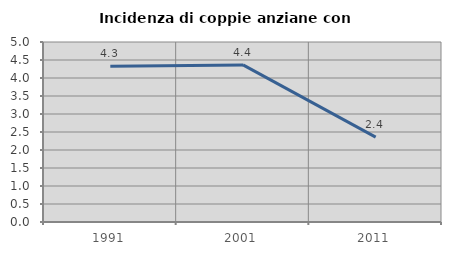
| Category | Incidenza di coppie anziane con figli |
|---|---|
| 1991.0 | 4.329 |
| 2001.0 | 4.364 |
| 2011.0 | 2.357 |